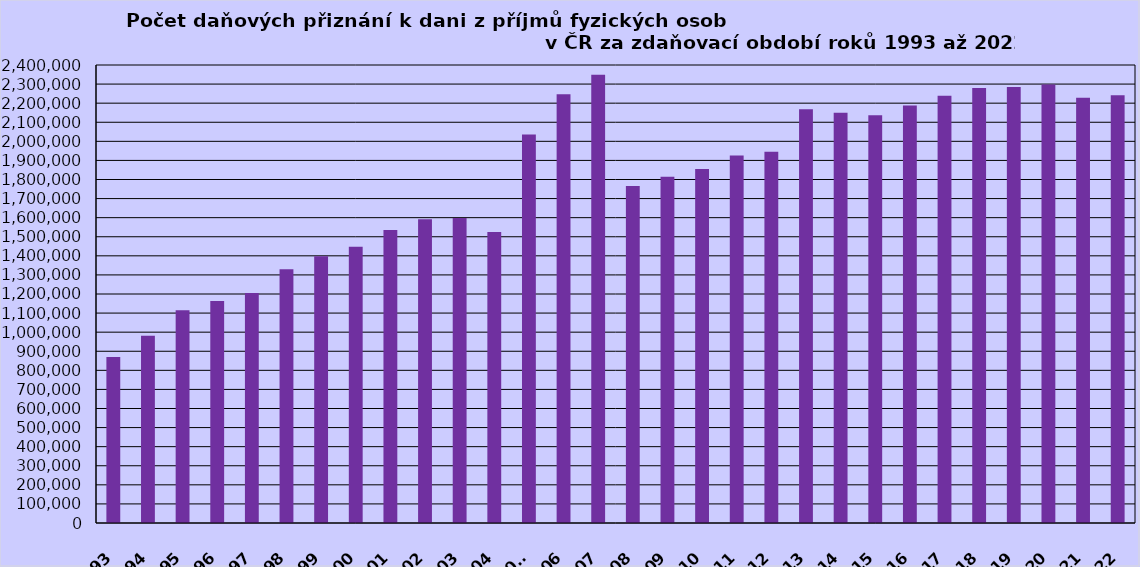
| Category | Series 0 |
|---|---|
| 1993 | 870485 |
| 1994 | 981759 |
| 1995 | 1115081 |
| 1996 | 1163781 |
| 1997 | 1205802 |
| 1998 | 1330034 |
| 1999 | 1398394 |
| 2000 | 1448084 |
| 2001 | 1535281 |
| 2002 | 1592244 |
| 2003 | 1598164 |
| 2004 | 1524649 |
| 2005* | 2036101 |
| 2006 | 2246839 |
| 2007 | 2348299 |
| 2008 | 1766154 |
| 2009 | 1814116 |
| 2010 | 1854944 |
| 2011 | 1925710 |
| 2012 | 1945651 |
| 2013 | 2167637 |
| 2014 | 2149665 |
| 2015 | 2136297 |
| 2016 | 2188337 |
| 2017 | 2238932 |
| 2018 | 2279353 |
| 2019 | 2285098 |
| 2020 | 2297196 |
| 2021 | 2228372 |
| 2022 | 2241246 |